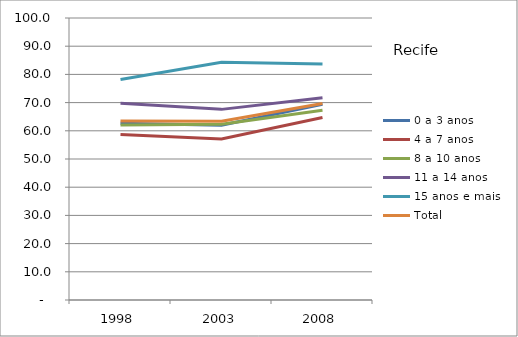
| Category | 0 a 3 anos | 4 a 7 anos | 8 a 10 anos | 11 a 14 anos | 15 anos e mais | Total |
|---|---|---|---|---|---|---|
| 1998.0 | 62.7 | 58.7 | 62.1 | 69.8 | 78.2 | 63.5 |
| 2003.0 | 62 | 57.1 | 62.3 | 67.6 | 84.3 | 63.4 |
| 2008.0 | 69.4 | 64.7 | 67.3 | 71.7 | 83.7 | 69.7 |